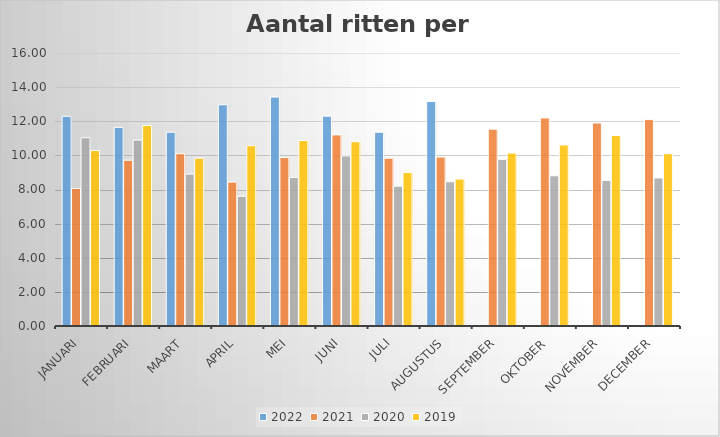
| Category | 2022 | 2021 | 2020 | 2019 |
|---|---|---|---|---|
| januari | 12.29 | 8.065 | 11.032 | 10.29 |
| februari | 11.643 | 9.714 | 10.897 | 11.75 |
| maart | 11.355 | 10.097 | 8.903 | 9.839 |
| april | 12.967 | 8.433 | 7.6 | 10.567 |
| mei | 13.419 | 9.871 | 8.71 | 10.871 |
| juni | 12.3 | 11.2 | 9.967 | 10.8 |
| juli | 11.355 | 9.839 | 8.194 | 9 |
| augustus | 13.161 | 9.903 | 8.452 | 8.613 |
| september | 0 | 11.533 | 9.767 | 10.133 |
| oktober | 0 | 12.194 | 8.806 | 10.613 |
| november | 0 | 11.9 | 8.533 | 11.167 |
| december | 0 | 12.097 | 8.677 | 10.097 |